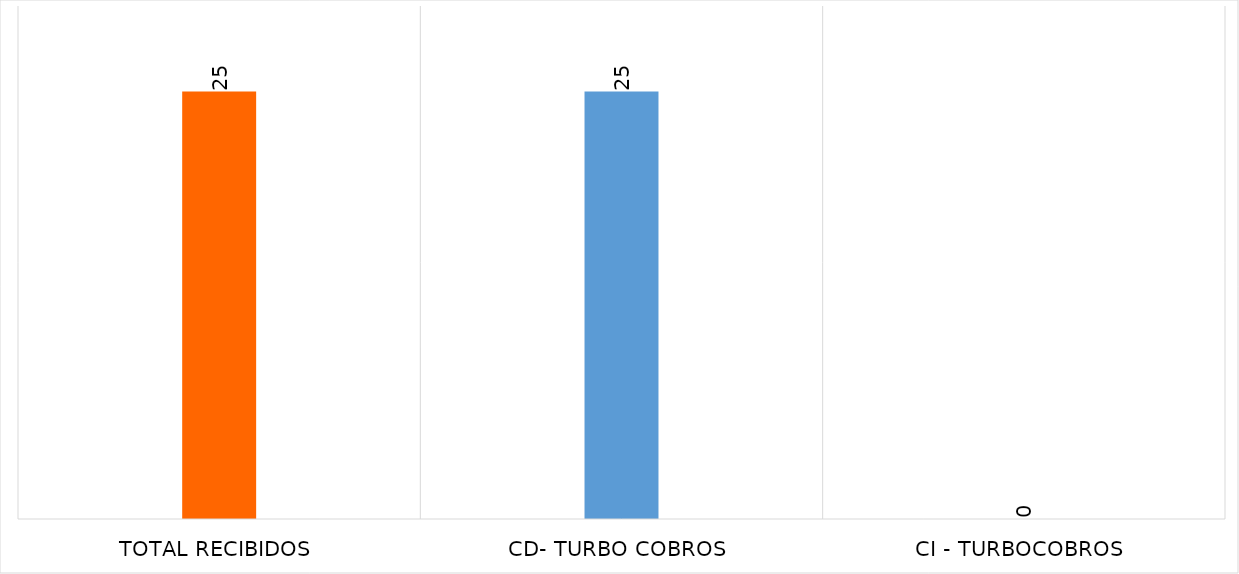
| Category | Series 0 |
|---|---|
| TOTAL RECIBIDOS | 25 |
| CD- TURBO COBROS | 25 |
| CI - TURBOCOBROS | 0 |